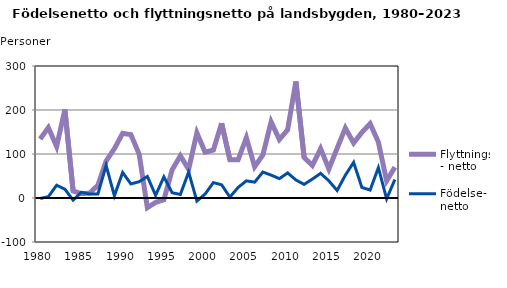
| Category | Flyttnings- netto | Födelse- netto |
|---|---|---|
| 1980.0 | 134 | -1 |
| 1981.0 | 160 | 3 |
| 1982.0 | 117 | 29 |
| 1983.0 | 201 | 20 |
| 1984.0 | 16 | -5 |
| 1985.0 | 10 | 13 |
| 1986.0 | 11 | 9 |
| 1987.0 | 29 | 9 |
| 1988.0 | 84 | 74 |
| 1989.0 | 112 | 5 |
| 1990.0 | 147 | 58 |
| 1991.0 | 144 | 32 |
| 1992.0 | 100 | 37 |
| 1993.0 | -22 | 49 |
| 1994.0 | -10 | 6 |
| 1995.0 | -4 | 48 |
| 1996.0 | 64 | 12 |
| 1997.0 | 96 | 8 |
| 1998.0 | 65 | 59 |
| 1999.0 | 148 | -7 |
| 2000.0 | 104 | 9 |
| 2001.0 | 109 | 35 |
| 2002.0 | 170 | 30 |
| 2003.0 | 87 | 2 |
| 2004.0 | 87 | 24 |
| 2005.0 | 137 | 39 |
| 2006.0 | 71 | 36 |
| 2007.0 | 98 | 59 |
| 2008.0 | 173 | 52 |
| 2009.0 | 133 | 44 |
| 2010.0 | 155 | 57 |
| 2011.0 | 265 | 41 |
| 2012.0 | 92 | 31 |
| 2013.0 | 74 | 43 |
| 2014.0 | 112 | 56 |
| 2015.0 | 66 | 39 |
| 2016.0 | 113 | 17 |
| 2017.0 | 159 | 52 |
| 2018.0 | 125 | 81 |
| 2019.0 | 149 | 24 |
| 2020.0 | 169 | 18 |
| 2021.0 | 127 | 69 |
| 2022.0 | 39 | -2 |
| 2023.0 | 70 | 42 |